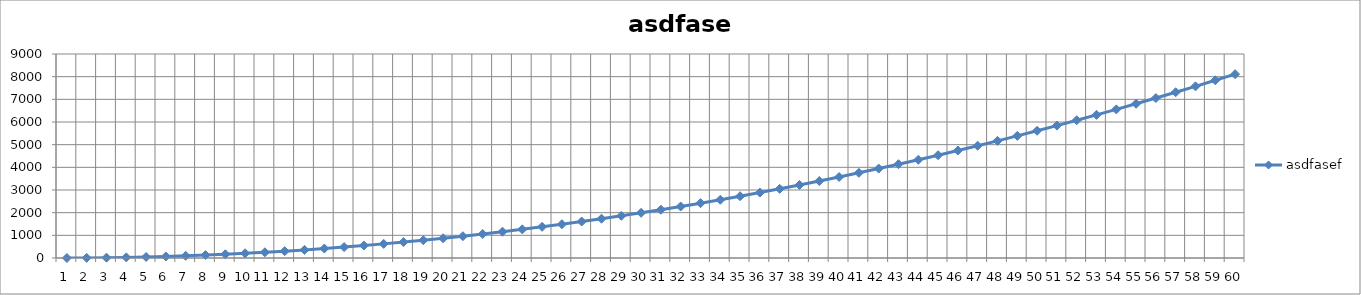
| Category | asdfasef |
|---|---|
| 0 | 0 |
| 1 | 4.582 |
| 2 | 13.746 |
| 3 | 27.492 |
| 4 | 45.821 |
| 5 | 68.731 |
| 6 | 96.223 |
| 7 | 128.298 |
| 8 | 164.954 |
| 9 | 206.193 |
| 10 | 252.013 |
| 11 | 302.416 |
| 12 | 357.401 |
| 13 | 416.968 |
| 14 | 481.117 |
| 15 | 549.847 |
| 16 | 623.16 |
| 17 | 701.056 |
| 18 | 783.533 |
| 19 | 870.592 |
| 20 | 962.233 |
| 21 | 1058.456 |
| 22 | 1159.262 |
| 23 | 1264.649 |
| 24 | 1374.619 |
| 25 | 1489.17 |
| 26 | 1608.304 |
| 27 | 1732.02 |
| 28 | 1860.317 |
| 29 | 1993.197 |
| 30 | 2130.659 |
| 31 | 2272.703 |
| 32 | 2419.329 |
| 33 | 2570.537 |
| 34 | 2726.327 |
| 35 | 2886.699 |
| 36 | 3051.653 |
| 37 | 3221.19 |
| 38 | 3395.308 |
| 39 | 3574.009 |
| 40 | 3757.291 |
| 41 | 3945.156 |
| 42 | 4137.602 |
| 43 | 4334.631 |
| 44 | 4536.242 |
| 45 | 4742.434 |
| 46 | 4953.209 |
| 47 | 5168.566 |
| 48 | 5388.505 |
| 49 | 5613.026 |
| 50 | 5842.129 |
| 51 | 6075.814 |
| 52 | 6314.082 |
| 53 | 6556.931 |
| 54 | 6804.362 |
| 55 | 7056.376 |
| 56 | 7312.971 |
| 57 | 7574.149 |
| 58 | 7839.908 |
| 59 | 8110.25 |